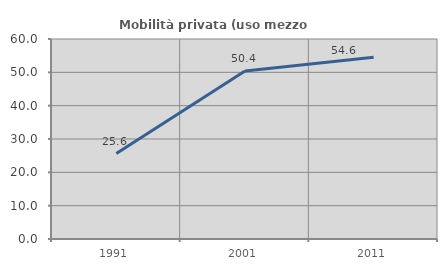
| Category | Mobilità privata (uso mezzo privato) |
|---|---|
| 1991.0 | 25.624 |
| 2001.0 | 50.41 |
| 2011.0 | 54.558 |